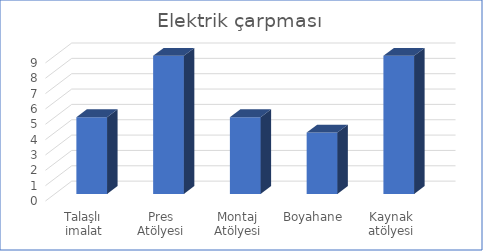
| Category | Elektrik çarpması |
|---|---|
| Talaşlı imalat Atölyesi | 5 |
| Pres Atölyesi | 9 |
| Montaj Atölyesi | 5 |
| Boyahane | 4 |
| Kaynak atölyesi | 9 |